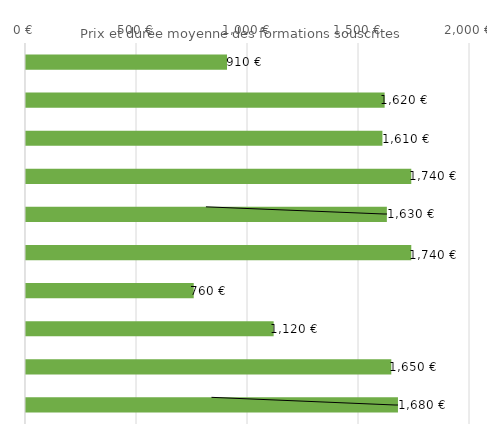
| Category | Series 0 |
|---|---|
| Permis de conduire catégorie B | 910 |
| Actions de formation dispensées aux créateurs et repreneurs d'entreprise | 1620 |
| Tests TOEIC (Test of English for International Communication) | 1610 |
| Bilan de compétences | 1740 |
| Utilisation d'un logiciel de tableur (ICDL - PCIE) | 1630 |
| Certification bureautique Excel | 1740 |
| Hygiène alimentaire dans les établissements de restauration commerciale | 760 |
| Accompagnement VAE | 1120 |
| Certification en anglais LanguageCert Test of English LTE (écouter, lire) - niveaux A1-C2 | 1650 |
| Utilisation d'un logiciel d'édition de site web (ICDL-PCIE) | 1680 |